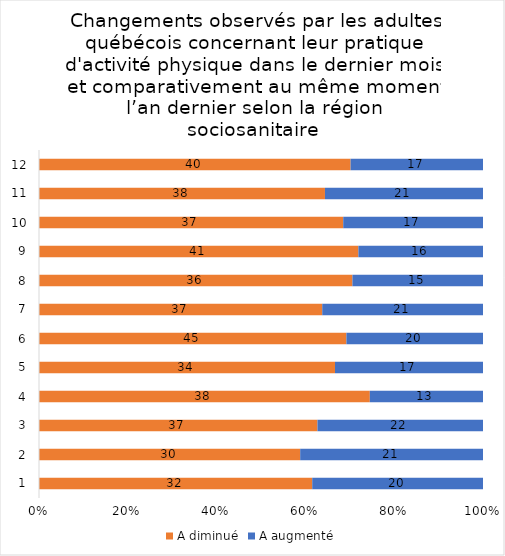
| Category | A diminué | A augmenté |
|---|---|---|
| 0 | 32 | 20 |
| 1 | 30 | 21 |
| 2 | 37 | 22 |
| 3 | 38 | 13 |
| 4 | 34 | 17 |
| 5 | 45 | 20 |
| 6 | 37 | 21 |
| 7 | 36 | 15 |
| 8 | 41 | 16 |
| 9 | 37 | 17 |
| 10 | 38 | 21 |
| 11 | 40 | 17 |